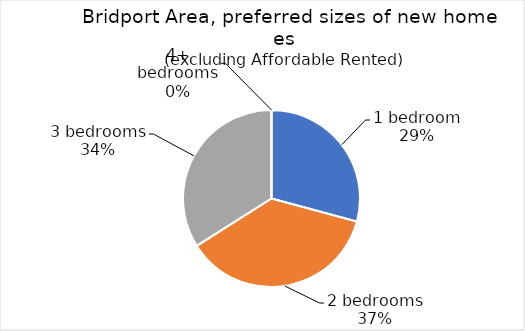
| Category | Series 0 |
|---|---|
| 1 bedroom | 0.292 |
| 2 bedrooms | 0.368 |
| 3 bedrooms | 0.34 |
| 4+ bedrooms | 0 |